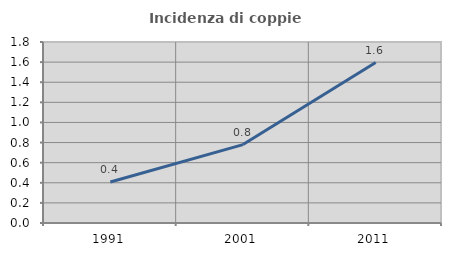
| Category | Incidenza di coppie miste |
|---|---|
| 1991.0 | 0.408 |
| 2001.0 | 0.78 |
| 2011.0 | 1.595 |